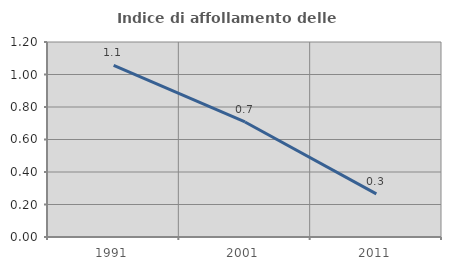
| Category | Indice di affollamento delle abitazioni  |
|---|---|
| 1991.0 | 1.056 |
| 2001.0 | 0.708 |
| 2011.0 | 0.265 |